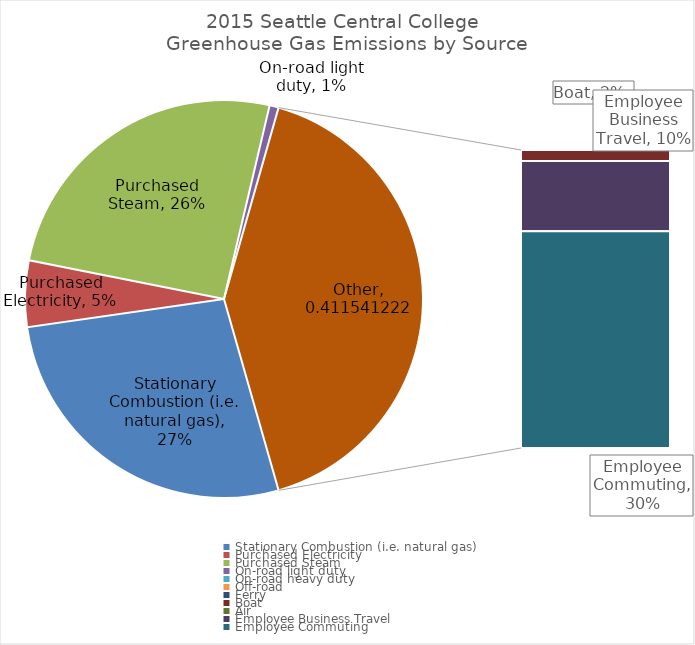
| Category | Percent of Greenhouse Gas Emissions |
|---|---|
| Stationary Combustion (i.e. natural gas) | 0.272 |
| Purchased Electricity | 0.054 |
| Purchased Steam | 0.256 |
| On-road light duty | 0.007 |
| On-road heavy duty | 0 |
| Off-road  | 0 |
| Ferry | 0 |
| Boat | 0.015 |
| Air | 0 |
| Employee Business Travel | 0.097 |
| Employee Commuting | 0.299 |